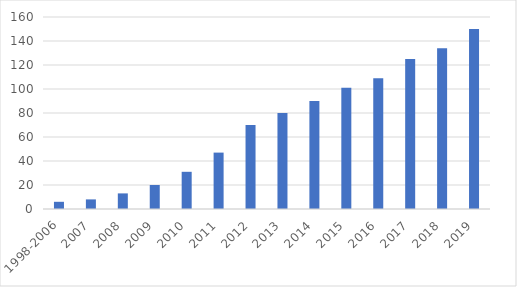
| Category | Series 0 |
|---|---|
| 1998-2006 | 6 |
| 2007 | 8 |
| 2008 | 13 |
| 2009 | 20 |
| 2010 | 31 |
| 2011 | 47 |
| 2012 | 70 |
| 2013 | 80 |
| 2014 | 90 |
| 2015 | 101 |
| 2016 | 109 |
| 2017 | 125 |
| 2018 | 134 |
| 2019 | 150 |